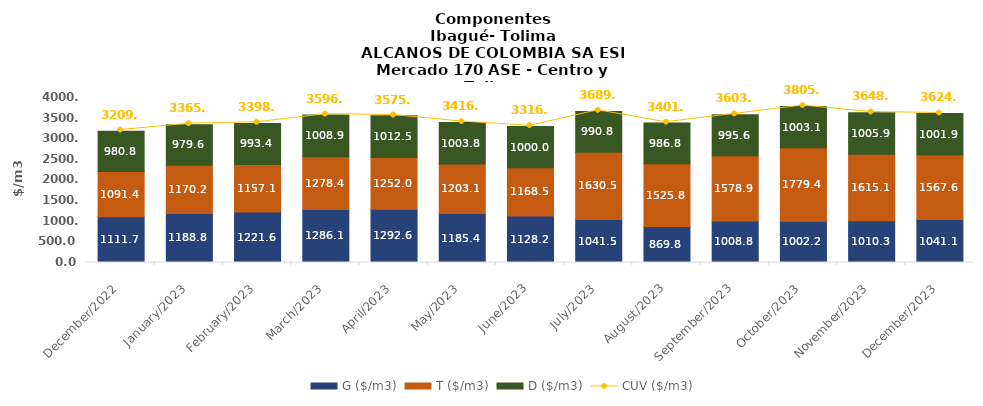
| Category | G ($/m3) | T ($/m3) | D ($/m3) |
|---|---|---|---|
| 2022-12-01 | 1111.69 | 1091.36 | 980.8 |
| 2023-01-01 | 1188.81 | 1170.15 | 979.57 |
| 2023-02-01 | 1221.59 | 1157.08 | 993.4 |
| 2023-03-01 | 1286.09 | 1278.38 | 1008.86 |
| 2023-04-01 | 1292.6 | 1251.95 | 1012.48 |
| 2023-05-01 | 1185.42 | 1203.07 | 1003.78 |
| 2023-06-01 | 1128.21 | 1168.47 | 999.96 |
| 2023-07-01 | 1041.54 | 1630.51 | 990.77 |
| 2023-08-01 | 869.82 | 1525.81 | 986.78 |
| 2023-09-01 | 1008.82 | 1578.87 | 995.55 |
| 2023-10-01 | 1002.24 | 1779.41 | 1003.05 |
| 2023-11-01 | 1010.34 | 1615.11 | 1005.88 |
| 2023-12-01 | 1041.14 | 1567.6 | 1001.9 |